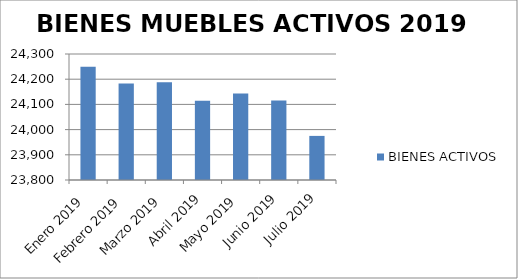
| Category | BIENES ACTIVOS |
|---|---|
| Enero 2019 | 24249 |
| Febrero 2019 | 24183 |
| Marzo 2019 | 24188 |
| Abril 2019 | 24114 |
| Mayo 2019 | 24143 |
| Junio 2019 | 24115 |
| Julio 2019 | 23975 |